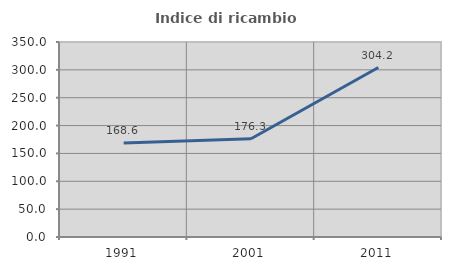
| Category | Indice di ricambio occupazionale  |
|---|---|
| 1991.0 | 168.627 |
| 2001.0 | 176.316 |
| 2011.0 | 304.167 |